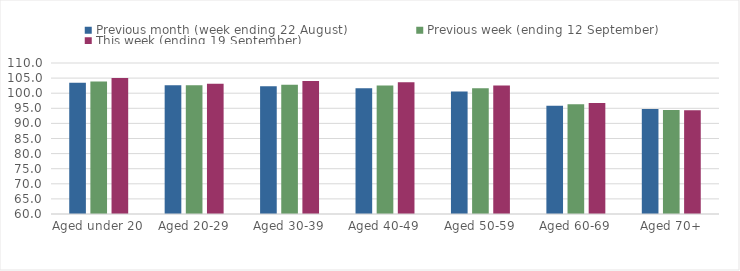
| Category | Previous month (week ending 22 August) | Previous week (ending 12 September) | This week (ending 19 September) |
|---|---|---|---|
| Aged under 20 | 103.49 | 103.86 | 105.03 |
| Aged 20-29 | 102.66 | 102.6 | 103.14 |
| Aged 30-39 | 102.29 | 102.76 | 104.02 |
| Aged 40-49 | 101.63 | 102.56 | 103.65 |
| Aged 50-59 | 100.59 | 101.61 | 102.52 |
| Aged 60-69 | 95.88 | 96.34 | 96.74 |
| Aged 70+ | 94.78 | 94.47 | 94.32 |